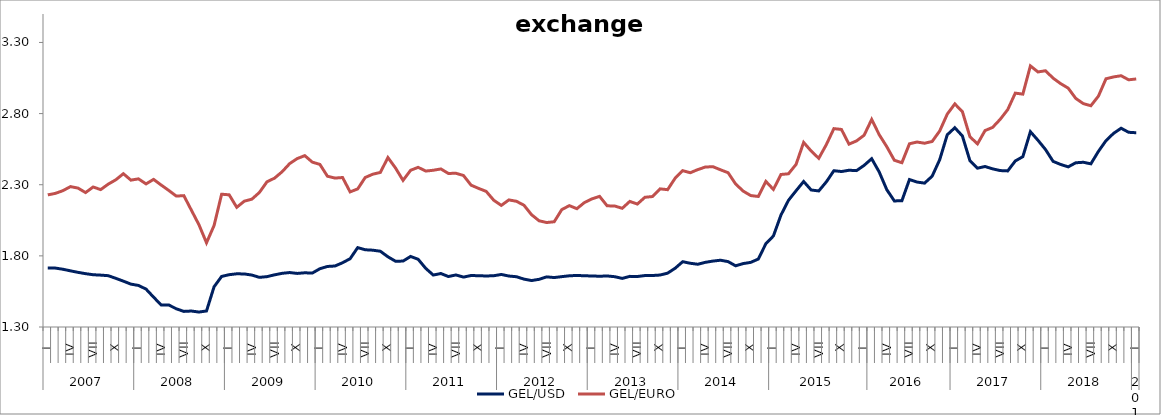
| Category | GEL/USD | GEL/EURO |
|---|---|---|
| 0 | 1.714 | 2.229 |
| 1 | 1.714 | 2.239 |
| 2 | 1.706 | 2.258 |
| 3 | 1.695 | 2.287 |
| 4 | 1.684 | 2.276 |
| 5 | 1.675 | 2.245 |
| 6 | 1.667 | 2.284 |
| 7 | 1.665 | 2.266 |
| 8 | 1.661 | 2.304 |
| 9 | 1.642 | 2.335 |
| 10 | 1.622 | 2.378 |
| 11 | 1.601 | 2.332 |
| 12 | 1.592 | 2.341 |
| 13 | 1.566 | 2.306 |
| 14 | 1.51 | 2.338 |
| 15 | 1.455 | 2.298 |
| 16 | 1.455 | 2.26 |
| 17 | 1.428 | 2.22 |
| 18 | 1.41 | 2.223 |
| 19 | 1.412 | 2.121 |
| 20 | 1.405 | 2.019 |
| 21 | 1.413 | 1.892 |
| 22 | 1.583 | 2.013 |
| 23 | 1.655 | 2.233 |
| 24 | 1.668 | 2.229 |
| 25 | 1.674 | 2.141 |
| 26 | 1.673 | 2.184 |
| 27 | 1.665 | 2.198 |
| 28 | 1.649 | 2.246 |
| 29 | 1.654 | 2.321 |
| 30 | 1.667 | 2.346 |
| 31 | 1.677 | 2.391 |
| 32 | 1.683 | 2.448 |
| 33 | 1.677 | 2.484 |
| 34 | 1.681 | 2.504 |
| 35 | 1.679 | 2.459 |
| 36 | 1.71 | 2.443 |
| 37 | 1.726 | 2.36 |
| 38 | 1.729 | 2.347 |
| 39 | 1.752 | 2.351 |
| 40 | 1.78 | 2.25 |
| 41 | 1.858 | 2.271 |
| 42 | 1.843 | 2.351 |
| 43 | 1.84 | 2.374 |
| 44 | 1.832 | 2.386 |
| 45 | 1.794 | 2.491 |
| 46 | 1.762 | 2.418 |
| 47 | 1.763 | 2.331 |
| 48 | 1.796 | 2.402 |
| 49 | 1.776 | 2.422 |
| 50 | 1.712 | 2.396 |
| 51 | 1.665 | 2.402 |
| 52 | 1.676 | 2.411 |
| 53 | 1.655 | 2.379 |
| 54 | 1.666 | 2.381 |
| 55 | 1.651 | 2.365 |
| 56 | 1.662 | 2.297 |
| 57 | 1.66 | 2.274 |
| 58 | 1.659 | 2.253 |
| 59 | 1.66 | 2.191 |
| 60 | 1.669 | 2.155 |
| 61 | 1.658 | 2.193 |
| 62 | 1.653 | 2.184 |
| 63 | 1.637 | 2.156 |
| 64 | 1.627 | 2.089 |
| 65 | 1.635 | 2.047 |
| 66 | 1.652 | 2.034 |
| 67 | 1.648 | 2.04 |
| 68 | 1.654 | 2.125 |
| 69 | 1.66 | 2.153 |
| 70 | 1.662 | 2.132 |
| 71 | 1.66 | 2.175 |
| 72 | 1.659 | 2.201 |
| 73 | 1.657 | 2.219 |
| 74 | 1.659 | 2.152 |
| 75 | 1.654 | 2.151 |
| 76 | 1.642 | 2.134 |
| 77 | 1.656 | 2.183 |
| 78 | 1.655 | 2.164 |
| 79 | 1.662 | 2.212 |
| 80 | 1.662 | 2.217 |
| 81 | 1.665 | 2.271 |
| 82 | 1.678 | 2.265 |
| 83 | 1.713 | 2.346 |
| 84 | 1.759 | 2.399 |
| 85 | 1.748 | 2.384 |
| 86 | 1.741 | 2.406 |
| 87 | 1.755 | 2.424 |
| 88 | 1.763 | 2.427 |
| 89 | 1.769 | 2.405 |
| 90 | 1.76 | 2.385 |
| 91 | 1.73 | 2.306 |
| 92 | 1.746 | 2.255 |
| 93 | 1.754 | 2.224 |
| 94 | 1.778 | 2.217 |
| 95 | 1.885 | 2.323 |
| 96 | 1.94 | 2.267 |
| 97 | 2.087 | 2.372 |
| 98 | 2.191 | 2.377 |
| 99 | 2.258 | 2.443 |
| 100 | 2.323 | 2.597 |
| 101 | 2.263 | 2.537 |
| 102 | 2.256 | 2.486 |
| 103 | 2.32 | 2.582 |
| 104 | 2.398 | 2.694 |
| 105 | 2.393 | 2.689 |
| 106 | 2.402 | 2.585 |
| 107 | 2.399 | 2.608 |
| 108 | 2.436 | 2.648 |
| 109 | 2.483 | 2.759 |
| 110 | 2.389 | 2.651 |
| 111 | 2.265 | 2.567 |
| 112 | 2.186 | 2.472 |
| 113 | 2.188 | 2.455 |
| 114 | 2.337 | 2.588 |
| 115 | 2.319 | 2.6 |
| 116 | 2.311 | 2.592 |
| 117 | 2.36 | 2.604 |
| 118 | 2.476 | 2.678 |
| 119 | 2.651 | 2.796 |
| 120 | 2.701 | 2.868 |
| 121 | 2.643 | 2.814 |
| 122 | 2.469 | 2.637 |
| 123 | 2.416 | 2.587 |
| 124 | 2.428 | 2.681 |
| 125 | 2.412 | 2.703 |
| 126 | 2.4 | 2.759 |
| 127 | 2.397 | 2.828 |
| 128 | 2.467 | 2.944 |
| 129 | 2.497 | 2.937 |
| 130 | 2.673 | 3.135 |
| 131 | 2.613 | 3.093 |
| 132 | 2.547 | 3.101 |
| 133 | 2.464 | 3.049 |
| 134 | 2.442 | 3.011 |
| 135 | 2.426 | 2.979 |
| 136 | 2.454 | 2.907 |
| 137 | 2.458 | 2.87 |
| 138 | 2.447 | 2.855 |
| 139 | 2.534 | 2.923 |
| 140 | 2.61 | 3.045 |
| 141 | 2.661 | 3.058 |
| 142 | 2.697 | 3.066 |
| 143 | 2.669 | 3.037 |
| 144 | 2.665 | 3.043 |